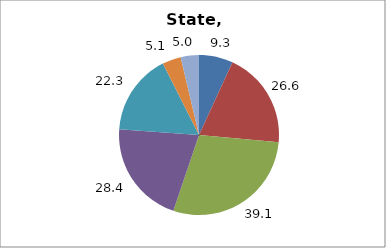
| Category | Series 0 |
|---|---|
| Higher Education | 9.345 |
| Elementary and Secondary Education | 26.579 |
| Total Education1 | 39.101 |
| Social Welfare2 | 28.442 |
| Transportation, Public Safety, Environment and Housing3 | 22.323 |
| Administration | 5.128 |
| Other4 | 5.006 |